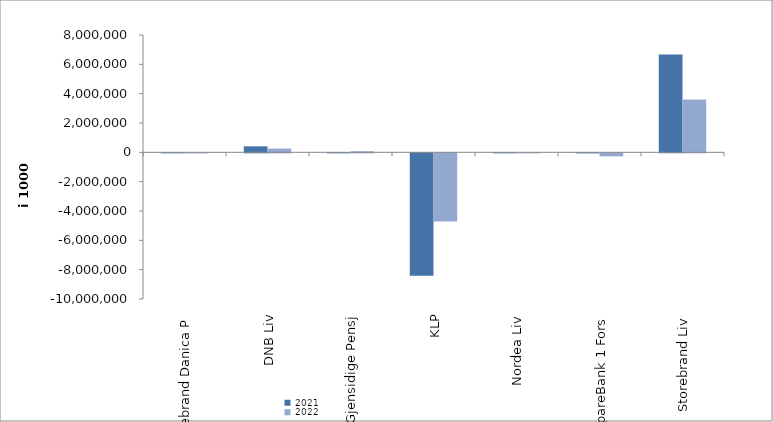
| Category | 2021 | 2022 |
|---|---|---|
| Storebrand Danica P | 917.594 | -4997.077 |
| DNB Liv | 408944.981 | 253788 |
| Gjensidige Pensj | -1853 | 74640 |
| KLP | -8346122.359 | -4649405.993 |
| Nordea Liv | 1913 | -1634.948 |
| SpareBank 1 Fors | -4756.54 | -204154 |
| Storebrand Liv | 6662972.674 | 3595002.943 |